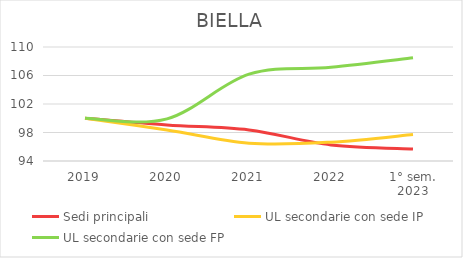
| Category | Sedi principali | UL secondarie con sede IP | UL secondarie con sede FP |
|---|---|---|---|
| 2019 | 100 | 100 | 100 |
| 2020 | 99.051 | 98.357 | 99.912 |
| 2021 | 98.357 | 96.5 | 106.184 |
| 2022 | 96.256 | 96.643 | 107.155 |
| 1° sem.
2023 | 95.701 | 97.714 | 108.481 |